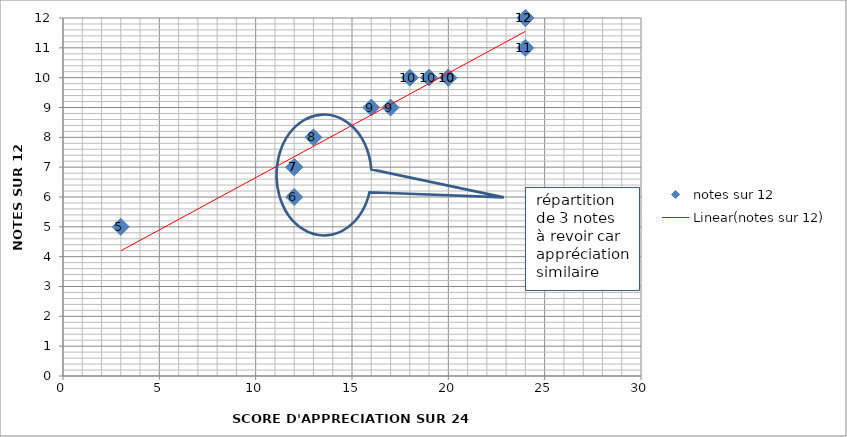
| Category | notes sur 12 |
|---|---|
| 3.0 | 5 |
| 12.0 | 6 |
| 12.0 | 7 |
| 12.0 | 7 |
| 13.0 | 8 |
| 16.0 | 9 |
| 17.0 | 9 |
| 18.0 | 10 |
| 19.0 | 10 |
| 20.0 | 10 |
| 20.0 | 10 |
| 24.0 | 11 |
| 24.0 | 12 |
| 24.0 | 12 |